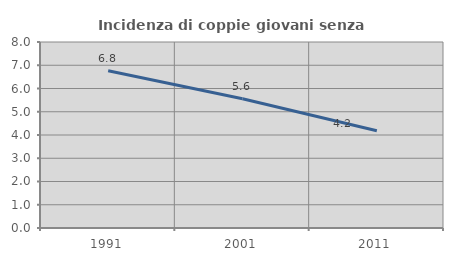
| Category | Incidenza di coppie giovani senza figli |
|---|---|
| 1991.0 | 6.766 |
| 2001.0 | 5.556 |
| 2011.0 | 4.183 |